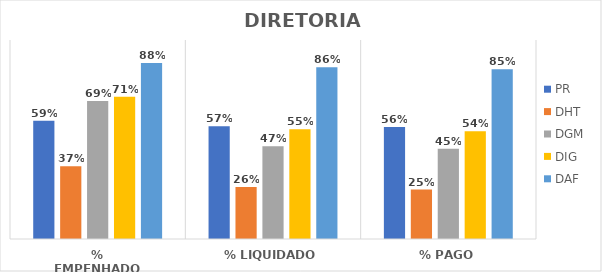
| Category | PR | DHT | DGM | DIG | DAF |
|---|---|---|---|---|---|
| % EMPENHADO | 0.595 | 0.365 | 0.694 | 0.715 | 0.885 |
| % LIQUIDADO | 0.566 | 0.261 | 0.466 | 0.551 | 0.863 |
| % PAGO | 0.563 | 0.249 | 0.454 | 0.542 | 0.853 |